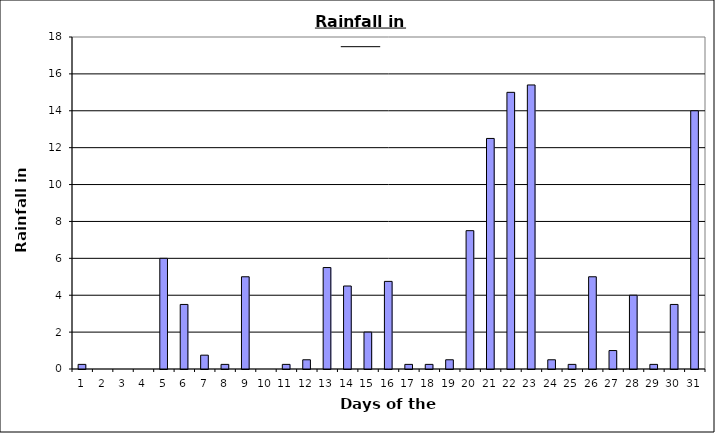
| Category | Series 0 |
|---|---|
| 0 | 0.25 |
| 1 | 0 |
| 2 | 0 |
| 3 | 0 |
| 4 | 6 |
| 5 | 3.5 |
| 6 | 0.75 |
| 7 | 0.25 |
| 8 | 5 |
| 9 | 0 |
| 10 | 0.25 |
| 11 | 0.5 |
| 12 | 5.5 |
| 13 | 4.5 |
| 14 | 2 |
| 15 | 4.75 |
| 16 | 0.25 |
| 17 | 0.25 |
| 18 | 0.5 |
| 19 | 7.5 |
| 20 | 12.5 |
| 21 | 15 |
| 22 | 15.4 |
| 23 | 0.5 |
| 24 | 0.25 |
| 25 | 5 |
| 26 | 1 |
| 27 | 4 |
| 28 | 0.25 |
| 29 | 3.5 |
| 30 | 14 |